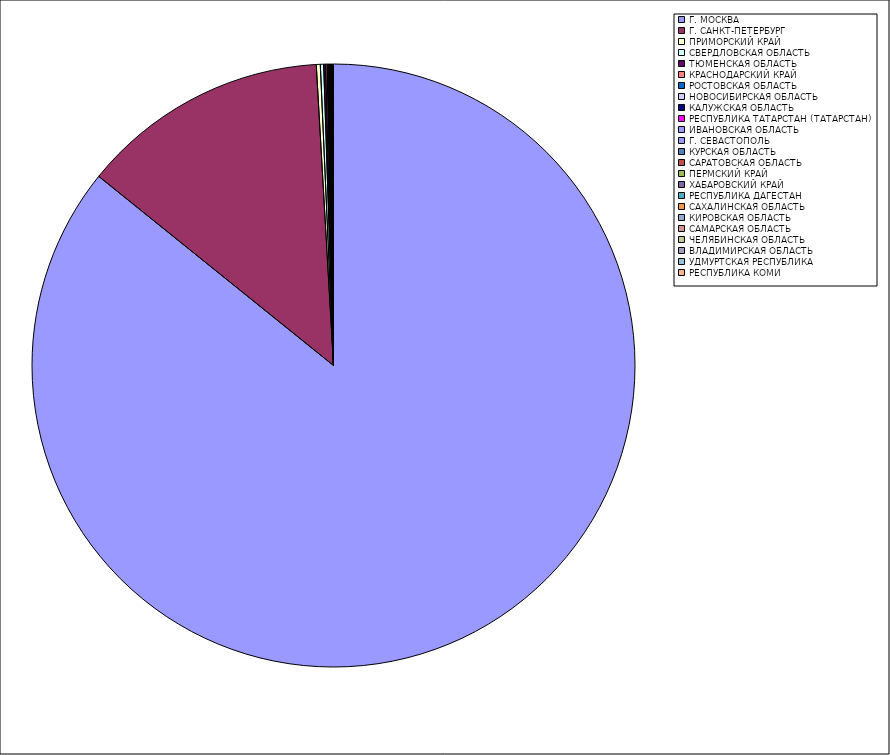
| Category | Оборот |
|---|---|
| Г. МОСКВА | 85.752 |
| Г. САНКТ-ПЕТЕРБУРГ | 13.289 |
| ПРИМОРСКИЙ КРАЙ | 0.214 |
| СВЕРДЛОВСКАЯ ОБЛАСТЬ | 0.177 |
| ТЮМЕНСКАЯ ОБЛАСТЬ | 0.1 |
| КРАСНОДАРСКИЙ КРАЙ | 0.082 |
| РОСТОВСКАЯ ОБЛАСТЬ | 0.042 |
| НОВОСИБИРСКАЯ ОБЛАСТЬ | 0.038 |
| КАЛУЖСКАЯ ОБЛАСТЬ | 0.033 |
| РЕСПУБЛИКА ТАТАРСТАН (ТАТАРСТАН) | 0.031 |
| ИВАНОВСКАЯ ОБЛАСТЬ | 0.028 |
| Г. СЕВАСТОПОЛЬ | 0.026 |
| КУРСКАЯ ОБЛАСТЬ | 0.024 |
| САРАТОВСКАЯ ОБЛАСТЬ | 0.022 |
| ПЕРМСКИЙ КРАЙ | 0.016 |
| ХАБАРОВСКИЙ КРАЙ | 0.013 |
| РЕСПУБЛИКА ДАГЕСТАН | 0.013 |
| САХАЛИНСКАЯ ОБЛАСТЬ | 0.012 |
| КИРОВСКАЯ ОБЛАСТЬ | 0.009 |
| САМАРСКАЯ ОБЛАСТЬ | 0.007 |
| ЧЕЛЯБИНСКАЯ ОБЛАСТЬ | 0.006 |
| ВЛАДИМИРСКАЯ ОБЛАСТЬ | 0.006 |
| УДМУРТСКАЯ РЕСПУБЛИКА | 0.006 |
| РЕСПУБЛИКА КОМИ | 0.006 |